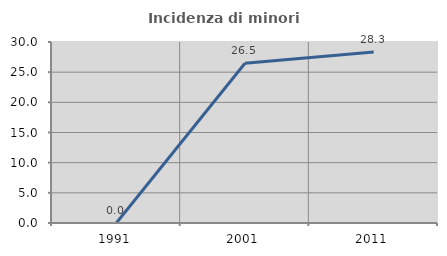
| Category | Incidenza di minori stranieri |
|---|---|
| 1991.0 | 0 |
| 2001.0 | 26.471 |
| 2011.0 | 28.333 |